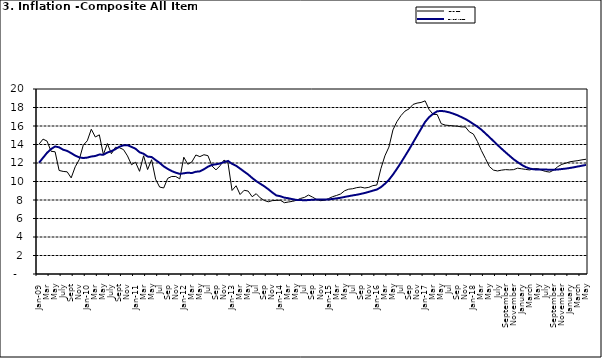
| Category | Year-on Rate | 12-Month Average |
|---|---|---|
| Jan-09 | 14.034 | 12.032 |
| Feb | 14.584 | 12.567 |
| Mar | 14.366 | 13.101 |
| Apr | 13.268 | 13.51 |
| May | 13.212 | 13.787 |
| June | 11.194 | 13.694 |
| July | 11.09 | 13.437 |
| Aug | 11.046 | 13.307 |
| Sept | 10.39 | 13.065 |
| Oct | 11.588 | 12.803 |
| Nov | 12.368 | 12.609 |
| Dec | 13.93 | 12.538 |
| Jan-10 | 14.398 | 12.586 |
| Feb | 15.649 | 12.7 |
| Mar | 14.812 | 12.757 |
| Apr | 15.044 | 12.915 |
| May | 12.915 | 12.893 |
| June | 14.099 | 13.132 |
| July | 13.002 | 13.284 |
| Aug | 13.702 | 13.5 |
| Sept | 13.65 | 13.764 |
| Oct | 13.45 | 13.908 |
| Nov | 12.766 | 13.928 |
| Dec | 11.815 | 13.74 |
| Jan-11 | 12.08 | 13.542 |
| Feb | 11.1 | 13.161 |
| Mar | 12.779 | 13.001 |
| Apr | 11.291 | 12.694 |
| May | 12.352 | 12.648 |
| Jun | 10.23 | 12.321 |
| Jul | 9.397 | 12.009 |
| Aug | 9.301 | 11.635 |
| Sep | 10.339 | 11.363 |
| Oct | 10.544 | 11.13 |
| Nov | 10.54 | 10.952 |
| Dec | 10.283 | 10.826 |
| Jan-12 | 12.626 | 10.886 |
| Feb | 11.866 | 10.955 |
| Mar | 12.111 | 10.914 |
| Apr | 12.866 | 11.054 |
| May | 12.688 | 11.096 |
| Jun | 12.892 | 11.32 |
| Jul | 12.797 | 11.599 |
| Aug | 11.689 | 11.791 |
| Sep | 11.253 | 11.859 |
| Oct | 11.693 | 11.948 |
| Nov | 12.32 | 12.091 |
| Dec | 11.981 | 12.224 |
| Jan-13 | 9.031 | 11.908 |
| Feb | 9.542 | 11.703 |
| Mar | 8.593 | 11.394 |
| Apr | 9.052 | 11.072 |
| May | 8.964 | 10.761 |
| Jun | 8.353 | 10.383 |
| Jul | 8.682 | 10.047 |
| Aug | 8.231 | 9.761 |
| Sep | 7.952 | 9.486 |
| Oct | 7.807 | 9.167 |
| Nov | 7.931 | 8.815 |
| Dec | 7.957 | 8.496 |
| Jan-14 | 7.977 | 8.408 |
| Feb | 7.707 | 8.257 |
| Mar | 7.783 | 8.19 |
| Apr | 7.851 | 8.092 |
| May | 7.965 | 8.012 |
| Jun | 8.167 | 7.998 |
| Jul | 8.281 | 7.968 |
| Aug | 8.534 | 7.996 |
| Sep | 8.317 | 8.027 |
| Oct | 8.06 | 8.047 |
| Nov | 7.927 | 8.046 |
| Dec | 7.978 | 8.047 |
| Jan-15 | 8.157 | 8.063 |
| Feb | 8.359 | 8.117 |
| Mar | 8.494 | 8.176 |
| Apr | 8.655 | 8.243 |
| May | 9.003 | 8.331 |
| Jun | 9.168 | 8.417 |
| Jul | 9.218 | 8.497 |
| Aug | 9.336 | 8.566 |
| Sep | 9.394 | 8.658 |
| Oct | 9.296 | 8.76 |
| Nov | 9.368 | 8.879 |
| Dec | 9.554 | 9.009 |
| Jan-16 | 9.617 | 9.13 |
| Feb | 11.379 | 9.386 |
| Mar | 12.775 | 9.751 |
| Apr | 13.721 | 10.182 |
| May | 15.577 | 10.746 |
| Jun | 16.48 | 11.372 |
| Jul | 17.127 | 12.045 |
| Aug | 17.609 | 12.744 |
| Sep | 17.852 | 13.454 |
| Oct | 18.33 | 14.206 |
| Nov | 18.476 | 14.958 |
| Dec | 18.547 | 15.697 |
| Jan-17 | 18.719 | 16.441 |
| Feb | 17.78 | 16.958 |
| Mar | 17.256 | 17.315 |
| Apr | 17.244 | 17.591 |
| May | 16.251 | 17.628 |
| Jun | 16.098 | 17.578 |
| Jul | 16.053 | 17.475 |
| Aug | 16.012 | 17.331 |
| Sep | 15.979 | 17.17 |
| Oct | 15.905 | 16.968 |
| Nov | 15.901 | 16.76 |
| Dec | 15.372 | 16.502 |
| Jan-18 | 15.127 | 16.215 |
| Feb | 14.33 | 15.93 |
| Mar | 13.337 | 15.599 |
| Apr | 12.482 | 15.196 |
| May | 11.608 | 14.793 |
| June | 11.231 | 14.371 |
| July | 11.142 | 13.95 |
| August | 11.227 | 13.546 |
| September | 11.284 | 13.157 |
| October | 11.259 | 12.777 |
| November | 11.281 | 12.406 |
| December | 11.442 | 12.095 |
| January | 11.374 | 11.801 |
| February | 11.306 | 11.564 |
| March | 11.251 | 11.401 |
| April | 11.372 | 11.314 |
| May | 11.396 | 11.299 |
| June | 11.217 | 11.297 |
| July | 11.084 | 11.291 |
| August | 11.016 | 11.271 |
| September | 11.244 | 11.268 |
| October | 11.607 | 11.298 |
| November | 11.854 | 11.348 |
| December | 11.982 | 11.396 |
| January | 12.132 | 11.462 |
| February | 12.199 | 11.539 |
| March | 12.257 | 11.624 |
| April | 12.341 | 11.706 |
| May | 12.404 | 11.791 |